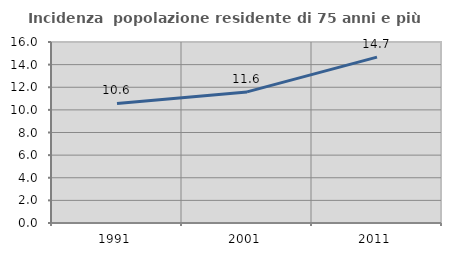
| Category | Incidenza  popolazione residente di 75 anni e più |
|---|---|
| 1991.0 | 10.567 |
| 2001.0 | 11.589 |
| 2011.0 | 14.662 |